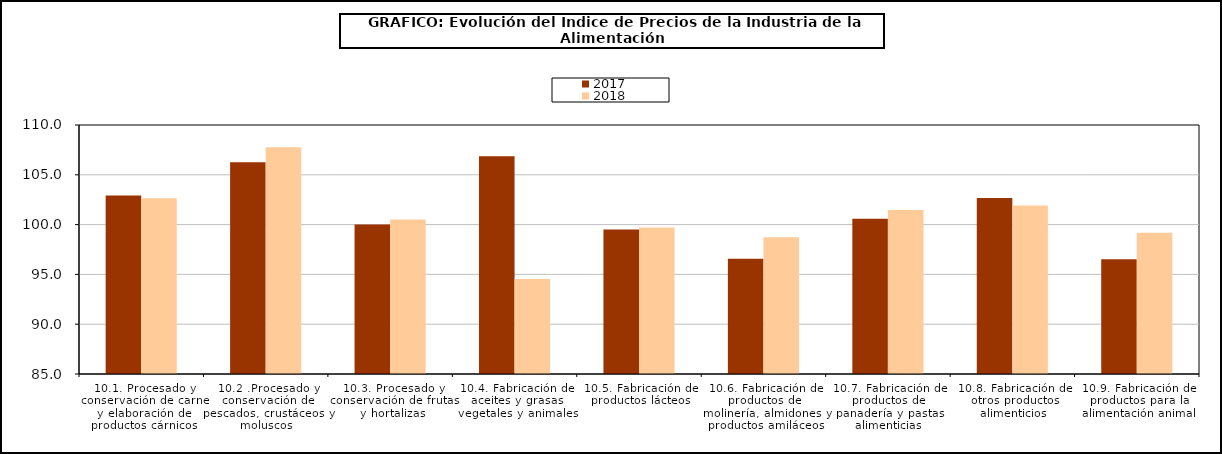
| Category | 2017 | 2018 |
|---|---|---|
| 10.1. Procesado y conservación de carne y elaboración de productos cárnicos | 102.909 | 102.643 |
| 10.2 .Procesado y conservación de pescados, crustáceos y moluscos | 106.26 | 107.763 |
| 10.3. Procesado y conservación de frutas y hortalizas | 100.011 | 100.505 |
| 10.4. Fabricación de aceites y grasas vegetales y animales | 106.86 | 94.55 |
| 10.5. Fabricación de productos lácteos | 99.52 | 99.701 |
| 10.6. Fabricación de productos de molinería, almidones y productos amiláceos | 96.559 | 98.723 |
| 10.7. Fabricación de productos de panadería y pastas alimenticias | 100.576 | 101.466 |
| 10.8. Fabricación de otros productos alimenticios | 102.664 | 101.915 |
| 10.9. Fabricación de productos para la alimentación animal | 96.517 | 99.19 |